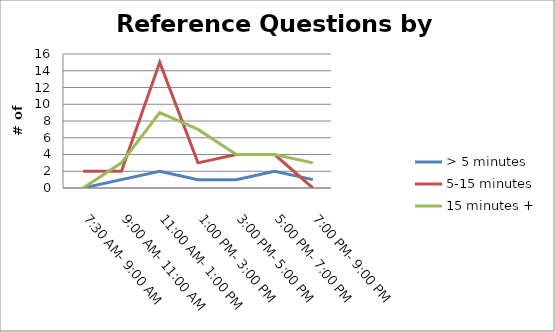
| Category | > 5 minutes | 5-15 minutes | 15 minutes + |
|---|---|---|---|
| 7:30 AM- 9:00 AM | 0 | 2 | 0 |
| 9:00 AM- 11:00 AM | 1 | 2 | 3 |
| 11:00 AM- 1:00 PM | 2 | 15 | 9 |
| 1:00 PM- 3:00 PM | 1 | 3 | 7 |
| 3:00 PM- 5:00 PM | 1 | 4 | 4 |
| 5:00 PM- 7:00 PM | 2 | 4 | 4 |
| 7:00 PM- 9:00 PM | 1 | 0 | 3 |